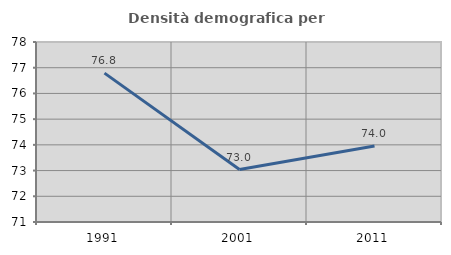
| Category | Densità demografica |
|---|---|
| 1991.0 | 76.789 |
| 2001.0 | 73.041 |
| 2011.0 | 73.959 |